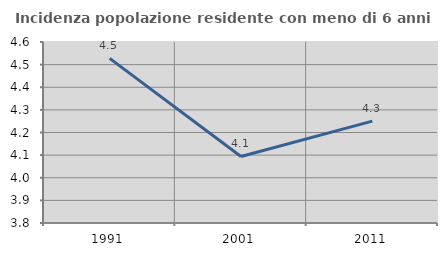
| Category | Incidenza popolazione residente con meno di 6 anni |
|---|---|
| 1991.0 | 4.528 |
| 2001.0 | 4.094 |
| 2011.0 | 4.25 |